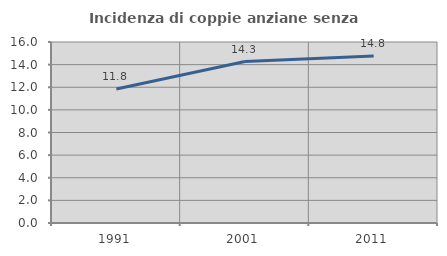
| Category | Incidenza di coppie anziane senza figli  |
|---|---|
| 1991.0 | 11.846 |
| 2001.0 | 14.275 |
| 2011.0 | 14.762 |